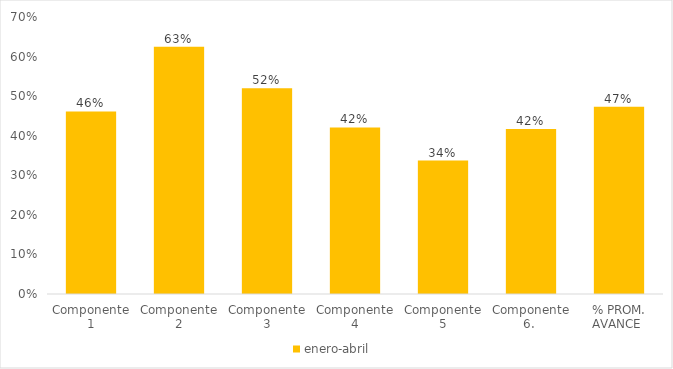
| Category | enero-abril  | mayo - agosto  | septiembre-diciembre |
|---|---|---|---|
| Componente 1 | 0.461 |  |  |
| Componente 2 | 0.625 |  |  |
| Componente 3 | 0.52 |  |  |
| Componente 4 | 0.421 |  |  |
| Componente 5 | 0.337 |  |  |
| Componente 6.  | 0.417 |  |  |
| % PROM. AVANCE  | 0.473 |  |  |